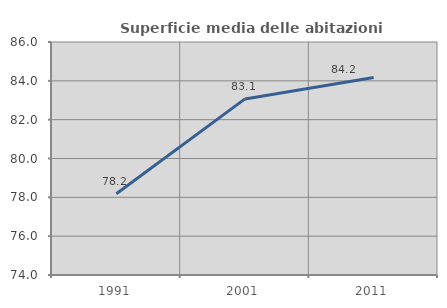
| Category | Superficie media delle abitazioni occupate |
|---|---|
| 1991.0 | 78.188 |
| 2001.0 | 83.07 |
| 2011.0 | 84.17 |